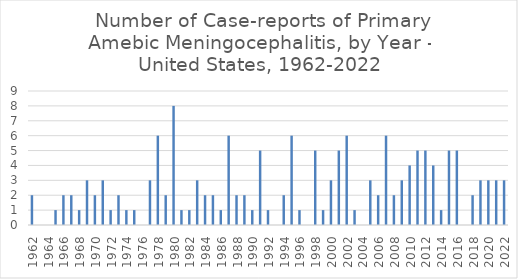
| Category | No. of Case-reports |
|---|---|
| 1962.0 | 2 |
| 1963.0 | 0 |
| 1964.0 | 0 |
| 1965.0 | 1 |
| 1966.0 | 2 |
| 1967.0 | 2 |
| 1968.0 | 1 |
| 1969.0 | 3 |
| 1970.0 | 2 |
| 1971.0 | 3 |
| 1972.0 | 1 |
| 1973.0 | 2 |
| 1974.0 | 1 |
| 1975.0 | 1 |
| 1976.0 | 0 |
| 1977.0 | 3 |
| 1978.0 | 6 |
| 1979.0 | 2 |
| 1980.0 | 8 |
| 1981.0 | 1 |
| 1982.0 | 1 |
| 1983.0 | 3 |
| 1984.0 | 2 |
| 1985.0 | 2 |
| 1986.0 | 1 |
| 1987.0 | 6 |
| 1988.0 | 2 |
| 1989.0 | 2 |
| 1990.0 | 1 |
| 1991.0 | 5 |
| 1992.0 | 1 |
| 1993.0 | 0 |
| 1994.0 | 2 |
| 1995.0 | 6 |
| 1996.0 | 1 |
| 1997.0 | 0 |
| 1998.0 | 5 |
| 1999.0 | 1 |
| 2000.0 | 3 |
| 2001.0 | 5 |
| 2002.0 | 6 |
| 2003.0 | 1 |
| 2004.0 | 0 |
| 2005.0 | 3 |
| 2006.0 | 2 |
| 2007.0 | 6 |
| 2008.0 | 2 |
| 2009.0 | 3 |
| 2010.0 | 4 |
| 2011.0 | 5 |
| 2012.0 | 5 |
| 2013.0 | 4 |
| 2014.0 | 1 |
| 2015.0 | 5 |
| 2016.0 | 5 |
| 2017.0 | 0 |
| 2018.0 | 2 |
| 2019.0 | 3 |
| 2020.0 | 3 |
| 2021.0 | 3 |
| 2022.0 | 3 |